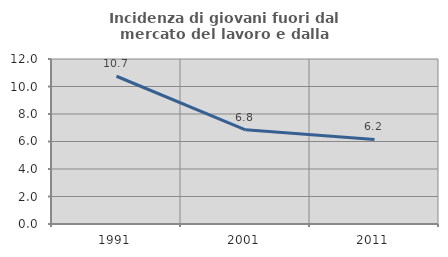
| Category | Incidenza di giovani fuori dal mercato del lavoro e dalla formazione  |
|---|---|
| 1991.0 | 10.746 |
| 2001.0 | 6.849 |
| 2011.0 | 6.154 |